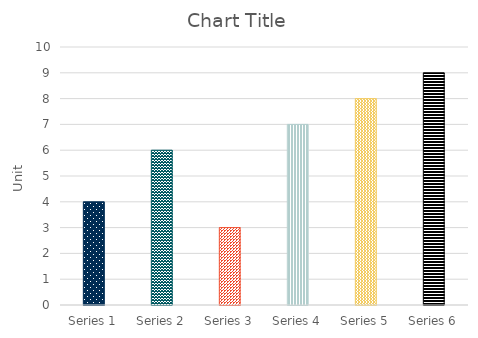
| Category | Series 0 |
|---|---|
| Series 1 | 4 |
| Series 2 | 6 |
| Series 3 | 3 |
| Series 4 | 7 |
| Series 5 | 8 |
| Series 6 | 9 |